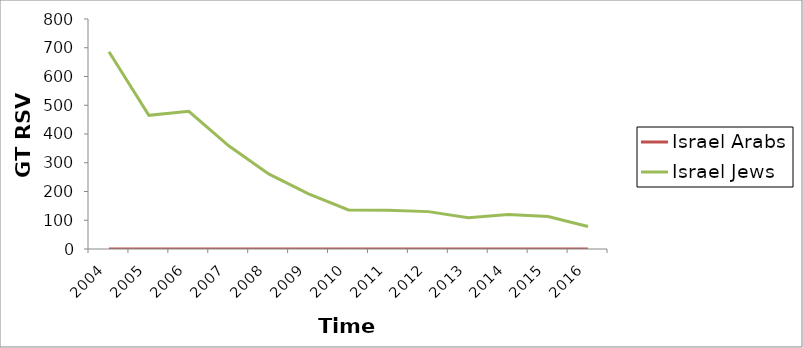
| Category | Israel Arabs | Israel Jews |
|---|---|---|
| 2004.0 | 0 | 686 |
| 2005.0 | 0 | 465 |
| 2006.0 | 0 | 479 |
| 2007.0 | 0 | 359 |
| 2008.0 | 0 | 261 |
| 2009.0 | 0 | 192 |
| 2010.0 | 0 | 136 |
| 2011.0 | 0 | 135 |
| 2012.0 | 0 | 130 |
| 2013.0 | 0 | 109 |
| 2014.0 | 0 | 120 |
| 2015.0 | 0 | 113 |
| 2016.0 | 0 | 78 |